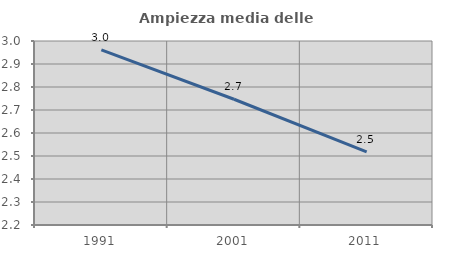
| Category | Ampiezza media delle famiglie |
|---|---|
| 1991.0 | 2.962 |
| 2001.0 | 2.747 |
| 2011.0 | 2.518 |